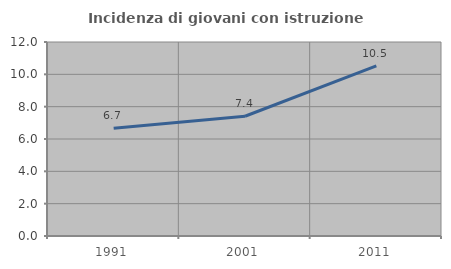
| Category | Incidenza di giovani con istruzione universitaria |
|---|---|
| 1991.0 | 6.667 |
| 2001.0 | 7.407 |
| 2011.0 | 10.526 |